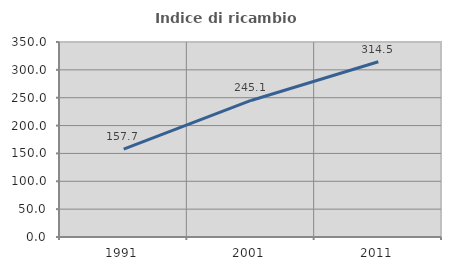
| Category | Indice di ricambio occupazionale  |
|---|---|
| 1991.0 | 157.692 |
| 2001.0 | 245.098 |
| 2011.0 | 314.516 |